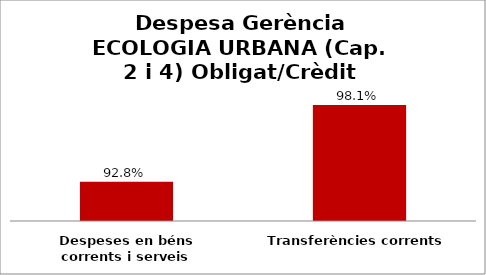
| Category | Series 0 |
|---|---|
| Despeses en béns corrents i serveis | 0.928 |
| Transferències corrents | 0.981 |